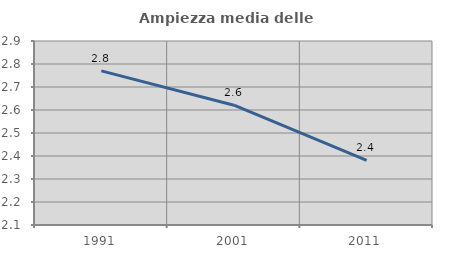
| Category | Ampiezza media delle famiglie |
|---|---|
| 1991.0 | 2.77 |
| 2001.0 | 2.621 |
| 2011.0 | 2.381 |